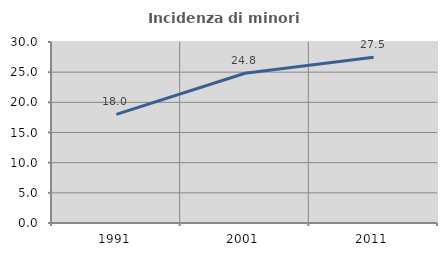
| Category | Incidenza di minori stranieri |
|---|---|
| 1991.0 | 18 |
| 2001.0 | 24.824 |
| 2011.0 | 27.478 |